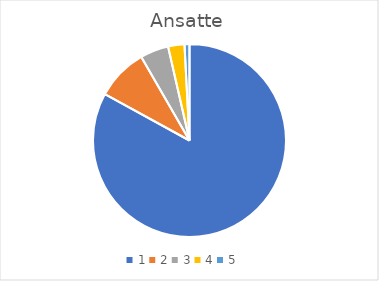
| Category | Series 0 |
|---|---|
| 0 | 69.7 |
| 1 | 7.3 |
| 2 | 4 |
| 3 | 2.3 |
| 4 | 0.7 |